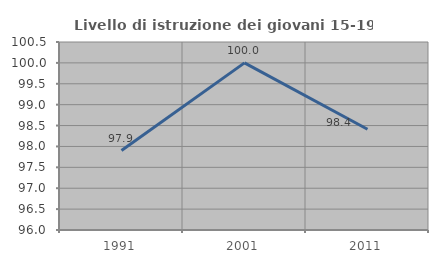
| Category | Livello di istruzione dei giovani 15-19 anni |
|---|---|
| 1991.0 | 97.902 |
| 2001.0 | 100 |
| 2011.0 | 98.413 |